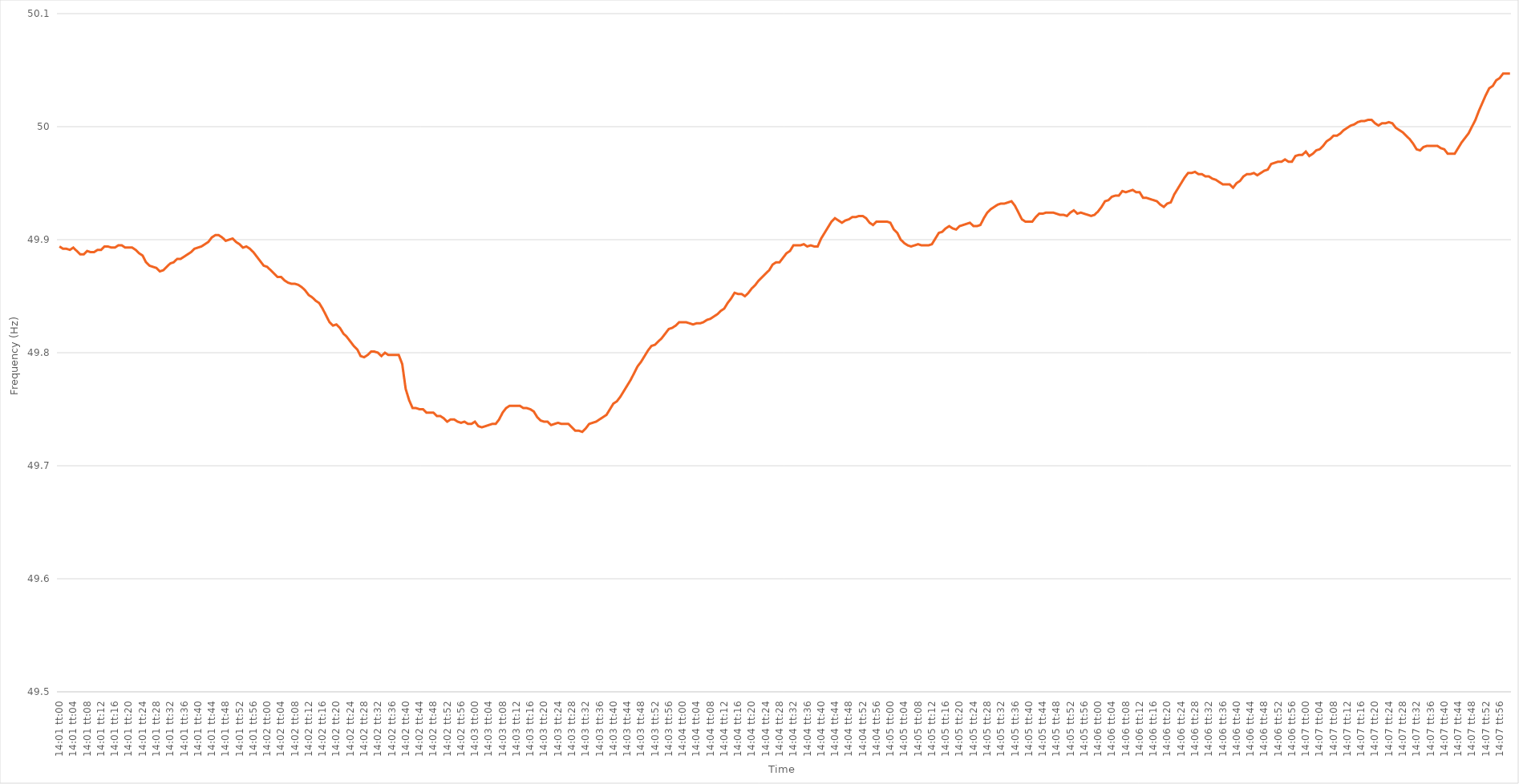
| Category | Series 0 |
|---|---|
| 0.5840277777777778 | 49.894 |
| 0.5840393518518519 | 49.892 |
| 0.5840509259259259 | 49.892 |
| 0.5840625 | 49.891 |
| 0.5840740740740741 | 49.893 |
| 0.5840856481481481 | 49.89 |
| 0.5840972222222222 | 49.887 |
| 0.5841087962962963 | 49.887 |
| 0.5841203703703703 | 49.89 |
| 0.5841319444444445 | 49.889 |
| 0.5841435185185185 | 49.889 |
| 0.5841550925925926 | 49.891 |
| 0.5841666666666666 | 49.891 |
| 0.5841782407407408 | 49.894 |
| 0.5841898148148148 | 49.894 |
| 0.584201388888889 | 49.893 |
| 0.584212962962963 | 49.893 |
| 0.584224537037037 | 49.895 |
| 0.5842361111111111 | 49.895 |
| 0.5842476851851852 | 49.893 |
| 0.5842592592592593 | 49.893 |
| 0.5842708333333334 | 49.893 |
| 0.5842824074074074 | 49.891 |
| 0.5842939814814815 | 49.888 |
| 0.5843055555555555 | 49.886 |
| 0.5843171296296296 | 49.88 |
| 0.5843287037037037 | 49.877 |
| 0.5843402777777778 | 49.876 |
| 0.5843518518518519 | 49.875 |
| 0.5843634259259259 | 49.872 |
| 0.584375 | 49.873 |
| 0.584386574074074 | 49.876 |
| 0.5843981481481482 | 49.879 |
| 0.5844097222222222 | 49.88 |
| 0.5844212962962964 | 49.883 |
| 0.5844328703703704 | 49.883 |
| 0.5844444444444444 | 49.885 |
| 0.5844560185185185 | 49.887 |
| 0.5844675925925926 | 49.889 |
| 0.5844791666666667 | 49.892 |
| 0.5844907407407408 | 49.893 |
| 0.5845023148148148 | 49.894 |
| 0.5845138888888889 | 49.896 |
| 0.5845254629629629 | 49.898 |
| 0.584537037037037 | 49.902 |
| 0.5845486111111111 | 49.904 |
| 0.5845601851851852 | 49.904 |
| 0.5845717592592593 | 49.902 |
| 0.5845833333333333 | 49.899 |
| 0.5845949074074074 | 49.9 |
| 0.5846064814814814 | 49.901 |
| 0.5846180555555556 | 49.898 |
| 0.5846296296296296 | 49.896 |
| 0.5846412037037038 | 49.893 |
| 0.5846527777777778 | 49.894 |
| 0.5846643518518518 | 49.892 |
| 0.5846759259259259 | 49.889 |
| 0.5846875 | 49.885 |
| 0.5846990740740741 | 49.881 |
| 0.5847106481481482 | 49.877 |
| 0.5847222222222223 | 49.876 |
| 0.5847337962962963 | 49.873 |
| 0.5847453703703703 | 49.87 |
| 0.5847569444444444 | 49.867 |
| 0.5847685185185185 | 49.867 |
| 0.5847800925925926 | 49.864 |
| 0.5847916666666667 | 49.862 |
| 0.5848032407407407 | 49.861 |
| 0.5848148148148148 | 49.861 |
| 0.5848263888888888 | 49.86 |
| 0.584837962962963 | 49.858 |
| 0.584849537037037 | 49.855 |
| 0.5848611111111112 | 49.851 |
| 0.5848726851851852 | 49.849 |
| 0.5848842592592592 | 49.846 |
| 0.5848958333333333 | 49.844 |
| 0.5849074074074074 | 49.839 |
| 0.5849189814814815 | 49.833 |
| 0.5849305555555556 | 49.827 |
| 0.5849421296296297 | 49.824 |
| 0.5849537037037037 | 49.825 |
| 0.5849652777777777 | 49.822 |
| 0.5849768518518519 | 49.817 |
| 0.5849884259259259 | 49.814 |
| 0.585 | 49.81 |
| 0.5850115740740741 | 49.806 |
| 0.5850231481481482 | 49.803 |
| 0.5850347222222222 | 49.797 |
| 0.5850462962962962 | 49.796 |
| 0.5850578703703704 | 49.798 |
| 0.5850694444444444 | 49.801 |
| 0.5850810185185186 | 49.801 |
| 0.5850925925925926 | 49.8 |
| 0.5851041666666666 | 49.797 |
| 0.5851157407407407 | 49.8 |
| 0.5851273148148148 | 49.798 |
| 0.5851388888888889 | 49.798 |
| 0.585150462962963 | 49.798 |
| 0.5851620370370371 | 49.798 |
| 0.5851736111111111 | 49.79 |
| 0.5851851851851851 | 49.768 |
| 0.5851967592592593 | 49.758 |
| 0.5852083333333333 | 49.751 |
| 0.5852199074074075 | 49.751 |
| 0.5852314814814815 | 49.75 |
| 0.5852430555555556 | 49.75 |
| 0.5852546296296296 | 49.747 |
| 0.5852662037037036 | 49.747 |
| 0.5852777777777778 | 49.747 |
| 0.5852893518518518 | 49.744 |
| 0.585300925925926 | 49.744 |
| 0.5853125 | 49.742 |
| 0.585324074074074 | 49.739 |
| 0.5853356481481481 | 49.741 |
| 0.5853472222222222 | 49.741 |
| 0.5853587962962963 | 49.739 |
| 0.5853703703703704 | 49.738 |
| 0.5853819444444445 | 49.739 |
| 0.5853935185185185 | 49.737 |
| 0.5854050925925925 | 49.737 |
| 0.5854166666666667 | 49.739 |
| 0.5854282407407407 | 49.735 |
| 0.5854398148148149 | 49.734 |
| 0.5854513888888889 | 49.735 |
| 0.585462962962963 | 49.736 |
| 0.585474537037037 | 49.737 |
| 0.585486111111111 | 49.737 |
| 0.5854976851851852 | 49.741 |
| 0.5855092592592592 | 49.747 |
| 0.5855208333333334 | 49.751 |
| 0.5855324074074074 | 49.753 |
| 0.5855439814814815 | 49.753 |
| 0.5855555555555555 | 49.753 |
| 0.5855671296296296 | 49.753 |
| 0.5855787037037037 | 49.751 |
| 0.5855902777777778 | 49.751 |
| 0.5856018518518519 | 49.75 |
| 0.5856134259259259 | 49.748 |
| 0.585625 | 49.743 |
| 0.5856365740740741 | 49.74 |
| 0.5856481481481481 | 49.739 |
| 0.5856597222222223 | 49.739 |
| 0.5856712962962963 | 49.736 |
| 0.5856828703703704 | 49.737 |
| 0.5856944444444444 | 49.738 |
| 0.5857060185185184 | 49.737 |
| 0.5857175925925926 | 49.737 |
| 0.5857291666666666 | 49.737 |
| 0.5857407407407408 | 49.734 |
| 0.5857523148148148 | 49.731 |
| 0.5857638888888889 | 49.731 |
| 0.5857754629629629 | 49.73 |
| 0.585787037037037 | 49.733 |
| 0.5857986111111111 | 49.737 |
| 0.5858101851851852 | 49.738 |
| 0.5858217592592593 | 49.739 |
| 0.5858333333333333 | 49.741 |
| 0.5858449074074074 | 49.743 |
| 0.5858564814814815 | 49.745 |
| 0.5858680555555555 | 49.75 |
| 0.5858796296296297 | 49.755 |
| 0.5858912037037037 | 49.757 |
| 0.5859027777777778 | 49.761 |
| 0.5859143518518518 | 49.766 |
| 0.585925925925926 | 49.771 |
| 0.5859375 | 49.776 |
| 0.585949074074074 | 49.782 |
| 0.5859606481481482 | 49.788 |
| 0.5859722222222222 | 49.792 |
| 0.5859837962962963 | 49.797 |
| 0.5859953703703703 | 49.802 |
| 0.5860069444444445 | 49.806 |
| 0.5860185185185185 | 49.807 |
| 0.5860300925925926 | 49.81 |
| 0.5860416666666667 | 49.813 |
| 0.5860532407407407 | 49.817 |
| 0.5860648148148148 | 49.821 |
| 0.5860763888888889 | 49.822 |
| 0.586087962962963 | 49.824 |
| 0.5860995370370371 | 49.827 |
| 0.5861111111111111 | 49.827 |
| 0.5861226851851852 | 49.827 |
| 0.5861342592592592 | 49.826 |
| 0.5861458333333334 | 49.825 |
| 0.5861574074074074 | 49.826 |
| 0.5861689814814816 | 49.826 |
| 0.5861805555555556 | 49.827 |
| 0.5861921296296296 | 49.829 |
| 0.5862037037037037 | 49.83 |
| 0.5862152777777777 | 49.832 |
| 0.5862268518518519 | 49.834 |
| 0.5862384259259259 | 49.837 |
| 0.58625 | 49.839 |
| 0.5862615740740741 | 49.844 |
| 0.5862731481481481 | 49.848 |
| 0.5862847222222222 | 49.853 |
| 0.5862962962962963 | 49.852 |
| 0.5863078703703704 | 49.852 |
| 0.5863194444444445 | 49.85 |
| 0.5863310185185185 | 49.853 |
| 0.5863425925925926 | 49.857 |
| 0.5863541666666666 | 49.86 |
| 0.5863657407407408 | 49.864 |
| 0.5863773148148148 | 49.867 |
| 0.586388888888889 | 49.87 |
| 0.586400462962963 | 49.873 |
| 0.586412037037037 | 49.878 |
| 0.5864236111111111 | 49.88 |
| 0.5864351851851851 | 49.88 |
| 0.5864467592592593 | 49.884 |
| 0.5864583333333333 | 49.888 |
| 0.5864699074074075 | 49.89 |
| 0.5864814814814815 | 49.895 |
| 0.5864930555555555 | 49.895 |
| 0.5865046296296296 | 49.895 |
| 0.5865162037037037 | 49.896 |
| 0.5865277777777778 | 49.894 |
| 0.5865393518518519 | 49.895 |
| 0.586550925925926 | 49.894 |
| 0.5865625 | 49.894 |
| 0.586574074074074 | 49.901 |
| 0.5865856481481482 | 49.906 |
| 0.5865972222222222 | 49.911 |
| 0.5866087962962964 | 49.916 |
| 0.5866203703703704 | 49.919 |
| 0.5866319444444444 | 49.917 |
| 0.5866435185185185 | 49.915 |
| 0.5866550925925925 | 49.917 |
| 0.5866666666666667 | 49.918 |
| 0.5866782407407407 | 49.92 |
| 0.5866898148148149 | 49.92 |
| 0.5867013888888889 | 49.921 |
| 0.5867129629629629 | 49.921 |
| 0.586724537037037 | 49.919 |
| 0.5867361111111111 | 49.915 |
| 0.5867476851851852 | 49.913 |
| 0.5867592592592593 | 49.916 |
| 0.5867708333333334 | 49.916 |
| 0.5867824074074074 | 49.916 |
| 0.5867939814814814 | 49.916 |
| 0.5868055555555556 | 49.915 |
| 0.5868171296296296 | 49.909 |
| 0.5868287037037038 | 49.906 |
| 0.5868402777777778 | 49.9 |
| 0.5868518518518518 | 49.897 |
| 0.5868634259259259 | 49.895 |
| 0.586875 | 49.894 |
| 0.5868865740740741 | 49.895 |
| 0.5868981481481481 | 49.896 |
| 0.5869097222222223 | 49.895 |
| 0.5869212962962963 | 49.895 |
| 0.5869328703703703 | 49.895 |
| 0.5869444444444444 | 49.896 |
| 0.5869560185185185 | 49.901 |
| 0.5869675925925926 | 49.906 |
| 0.5869791666666667 | 49.907 |
| 0.5869907407407408 | 49.91 |
| 0.5870023148148148 | 49.912 |
| 0.5870138888888888 | 49.91 |
| 0.587025462962963 | 49.909 |
| 0.587037037037037 | 49.912 |
| 0.5870486111111112 | 49.913 |
| 0.5870601851851852 | 49.914 |
| 0.5870717592592593 | 49.915 |
| 0.5870833333333333 | 49.912 |
| 0.5870949074074074 | 49.912 |
| 0.5871064814814815 | 49.913 |
| 0.5871180555555556 | 49.919 |
| 0.5871296296296297 | 49.924 |
| 0.5871412037037037 | 49.927 |
| 0.5871527777777777 | 49.929 |
| 0.5871643518518518 | 49.931 |
| 0.5871759259259259 | 49.932 |
| 0.5871875 | 49.932 |
| 0.5871990740740741 | 49.933 |
| 0.5872106481481482 | 49.934 |
| 0.5872222222222222 | 49.93 |
| 0.5872337962962962 | 49.924 |
| 0.5872453703703704 | 49.918 |
| 0.5872569444444444 | 49.916 |
| 0.5872685185185186 | 49.916 |
| 0.5872800925925926 | 49.916 |
| 0.5872916666666667 | 49.92 |
| 0.5873032407407407 | 49.923 |
| 0.5873148148148148 | 49.923 |
| 0.5873263888888889 | 49.924 |
| 0.587337962962963 | 49.924 |
| 0.5873495370370371 | 49.924 |
| 0.5873611111111111 | 49.923 |
| 0.5873726851851852 | 49.922 |
| 0.5873842592592592 | 49.922 |
| 0.5873958333333333 | 49.921 |
| 0.5874074074074074 | 49.924 |
| 0.5874189814814815 | 49.926 |
| 0.5874305555555556 | 49.923 |
| 0.5874421296296296 | 49.924 |
| 0.5874537037037036 | 49.923 |
| 0.5874652777777778 | 49.922 |
| 0.5874768518518518 | 49.921 |
| 0.587488425925926 | 49.922 |
| 0.5875 | 49.925 |
| 0.5875115740740741 | 49.929 |
| 0.5875231481481481 | 49.934 |
| 0.5875347222222222 | 49.935 |
| 0.5875462962962963 | 49.938 |
| 0.5875578703703704 | 49.939 |
| 0.5875694444444445 | 49.939 |
| 0.5875810185185185 | 49.943 |
| 0.5875925925925926 | 49.942 |
| 0.5876041666666666 | 49.943 |
| 0.5876157407407407 | 49.944 |
| 0.5876273148148148 | 49.942 |
| 0.5876388888888889 | 49.942 |
| 0.587650462962963 | 49.937 |
| 0.587662037037037 | 49.937 |
| 0.587673611111111 | 49.936 |
| 0.5876851851851852 | 49.935 |
| 0.5876967592592592 | 49.934 |
| 0.5877083333333334 | 49.931 |
| 0.5877199074074074 | 49.929 |
| 0.5877314814814815 | 49.932 |
| 0.5877430555555555 | 49.933 |
| 0.5877546296296297 | 49.94 |
| 0.5877662037037037 | 49.945 |
| 0.5877777777777778 | 49.95 |
| 0.5877893518518519 | 49.955 |
| 0.5878009259259259 | 49.959 |
| 0.5878125 | 49.959 |
| 0.5878240740740741 | 49.96 |
| 0.5878356481481481 | 49.958 |
| 0.5878472222222222 | 49.958 |
| 0.5878587962962963 | 49.956 |
| 0.5878703703703704 | 49.956 |
| 0.5878819444444444 | 49.954 |
| 0.5878935185185185 | 49.953 |
| 0.5879050925925926 | 49.951 |
| 0.5879166666666666 | 49.949 |
| 0.5879282407407408 | 49.949 |
| 0.5879398148148148 | 49.949 |
| 0.5879513888888889 | 49.946 |
| 0.5879629629629629 | 49.95 |
| 0.5879745370370371 | 49.952 |
| 0.5879861111111111 | 49.956 |
| 0.5879976851851852 | 49.958 |
| 0.5880092592592593 | 49.958 |
| 0.5880208333333333 | 49.959 |
| 0.5880324074074074 | 49.957 |
| 0.5880439814814815 | 49.959 |
| 0.5880555555555556 | 49.961 |
| 0.5880671296296297 | 49.962 |
| 0.5880787037037037 | 49.967 |
| 0.5880902777777778 | 49.968 |
| 0.5881018518518518 | 49.969 |
| 0.5881134259259259 | 49.969 |
| 0.588125 | 49.971 |
| 0.588136574074074 | 49.969 |
| 0.5881481481481482 | 49.969 |
| 0.5881597222222222 | 49.974 |
| 0.5881712962962963 | 49.975 |
| 0.5881828703703703 | 49.975 |
| 0.5881944444444445 | 49.978 |
| 0.5882060185185185 | 49.974 |
| 0.5882175925925927 | 49.976 |
| 0.5882291666666667 | 49.979 |
| 0.5882407407407407 | 49.98 |
| 0.5882523148148148 | 49.983 |
| 0.5882638888888889 | 49.987 |
| 0.588275462962963 | 49.989 |
| 0.5882870370370371 | 49.992 |
| 0.5882986111111111 | 49.992 |
| 0.5883101851851852 | 49.994 |
| 0.5883217592592592 | 49.997 |
| 0.5883333333333333 | 49.999 |
| 0.5883449074074074 | 50.001 |
| 0.5883564814814815 | 50.002 |
| 0.5883680555555556 | 50.004 |
| 0.5883796296296296 | 50.005 |
| 0.5883912037037037 | 50.005 |
| 0.5884027777777777 | 50.006 |
| 0.5884143518518519 | 50.006 |
| 0.5884259259259259 | 50.003 |
| 0.5884375000000001 | 50.001 |
| 0.5884490740740741 | 50.003 |
| 0.5884606481481481 | 50.003 |
| 0.5884722222222222 | 50.004 |
| 0.5884837962962963 | 50.003 |
| 0.5884953703703704 | 49.999 |
| 0.5885069444444445 | 49.997 |
| 0.5885185185185186 | 49.995 |
| 0.5885300925925926 | 49.992 |
| 0.5885416666666666 | 49.989 |
| 0.5885532407407407 | 49.985 |
| 0.5885648148148148 | 49.98 |
| 0.5885763888888889 | 49.979 |
| 0.588587962962963 | 49.982 |
| 0.588599537037037 | 49.983 |
| 0.5886111111111111 | 49.983 |
| 0.5886226851851851 | 49.983 |
| 0.5886342592592593 | 49.983 |
| 0.5886458333333333 | 49.981 |
| 0.5886574074074075 | 49.98 |
| 0.5886689814814815 | 49.976 |
| 0.5886805555555555 | 49.976 |
| 0.5886921296296296 | 49.976 |
| 0.5887037037037037 | 49.981 |
| 0.5887152777777778 | 49.986 |
| 0.5887268518518519 | 49.99 |
| 0.588738425925926 | 49.994 |
| 0.58875 | 50 |
| 0.588761574074074 | 50.006 |
| 0.5887731481481482 | 50.014 |
| 0.5887847222222222 | 50.021 |
| 0.5887962962962963 | 50.028 |
| 0.5888078703703704 | 50.034 |
| 0.5888194444444445 | 50.036 |
| 0.5888310185185185 | 50.041 |
| 0.5888425925925925 | 50.043 |
| 0.5888541666666667 | 50.047 |
| 0.5888657407407407 | 50.047 |
| 0.5888773148148149 | 50.047 |